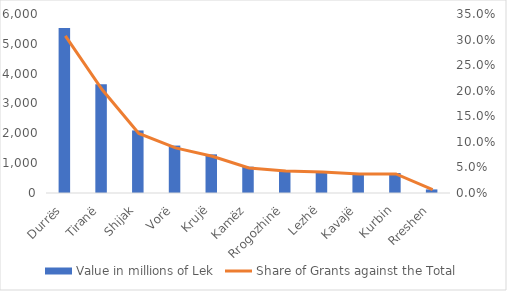
| Category | Value in millions of Lek |
|---|---|
| Durrës | 5534.132 |
| Tiranë | 3642.007 |
| Shijak | 2097.161 |
| Vorë | 1589.576 |
| Krujë | 1295.092 |
| Kamëz | 883.044 |
| Rrogozhinë | 771.097 |
| Lezhë | 737.191 |
| Kavajë | 666.938 |
| Kurbin | 669.767 |
| Rreshen | 119.963 |